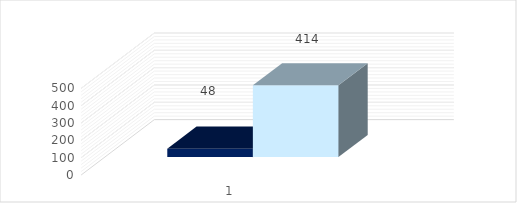
| Category | положительных |
|---|---|
| 0 | 414 |